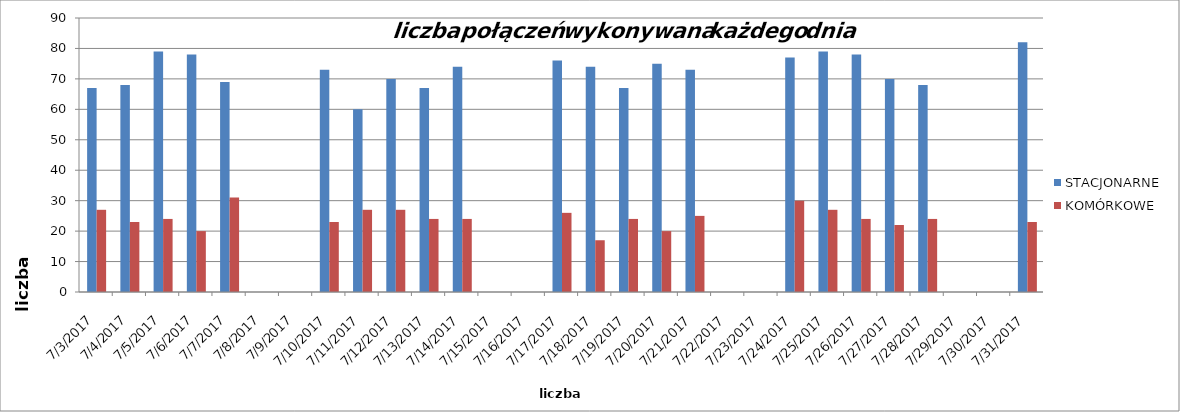
| Category | STACJONARNE | KOMÓRKOWE |
|---|---|---|
| 2017-07-03 | 67 | 27 |
| 2017-07-04 | 68 | 23 |
| 2017-07-05 | 79 | 24 |
| 2017-07-06 | 78 | 20 |
| 2017-07-07 | 69 | 31 |
| 2017-07-10 | 73 | 23 |
| 2017-07-11 | 60 | 27 |
| 2017-07-12 | 70 | 27 |
| 2017-07-13 | 67 | 24 |
| 2017-07-14 | 74 | 24 |
| 2017-07-17 | 76 | 26 |
| 2017-07-18 | 74 | 17 |
| 2017-07-19 | 67 | 24 |
| 2017-07-20 | 75 | 20 |
| 2017-07-21 | 73 | 25 |
| 2017-07-24 | 77 | 30 |
| 2017-07-25 | 79 | 27 |
| 2017-07-26 | 78 | 24 |
| 2017-07-27 | 70 | 22 |
| 2017-07-28 | 68 | 24 |
| 2017-07-31 | 82 | 23 |